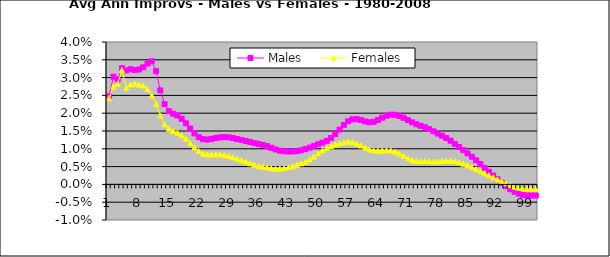
| Category | Males | Females |
|---|---|---|
| 0 | 0.025 | 0.024 |
| 1 | 0.03 | 0.028 |
| 2 | 0.029 | 0.028 |
| 3 | 0.033 | 0.032 |
| 4 | 0.032 | 0.027 |
| 5 | 0.032 | 0.028 |
| 6 | 0.032 | 0.028 |
| 7 | 0.032 | 0.028 |
| 8 | 0.033 | 0.028 |
| 9 | 0.034 | 0.027 |
| 10 | 0.035 | 0.025 |
| 11 | 0.032 | 0.023 |
| 12 | 0.026 | 0.019 |
| 13 | 0.023 | 0.017 |
| 14 | 0.021 | 0.016 |
| 15 | 0.02 | 0.015 |
| 16 | 0.019 | 0.014 |
| 17 | 0.018 | 0.014 |
| 18 | 0.017 | 0.013 |
| 19 | 0.016 | 0.012 |
| 20 | 0.014 | 0.01 |
| 21 | 0.013 | 0.009 |
| 22 | 0.013 | 0.009 |
| 23 | 0.013 | 0.008 |
| 24 | 0.013 | 0.008 |
| 25 | 0.013 | 0.008 |
| 26 | 0.013 | 0.008 |
| 27 | 0.013 | 0.008 |
| 28 | 0.013 | 0.008 |
| 29 | 0.013 | 0.008 |
| 30 | 0.013 | 0.007 |
| 31 | 0.013 | 0.007 |
| 32 | 0.012 | 0.006 |
| 33 | 0.012 | 0.006 |
| 34 | 0.012 | 0.006 |
| 35 | 0.011 | 0.005 |
| 36 | 0.011 | 0.005 |
| 37 | 0.011 | 0.005 |
| 38 | 0.01 | 0.005 |
| 39 | 0.01 | 0.004 |
| 40 | 0.009 | 0.004 |
| 41 | 0.009 | 0.005 |
| 42 | 0.009 | 0.005 |
| 43 | 0.009 | 0.005 |
| 44 | 0.009 | 0.006 |
| 45 | 0.01 | 0.006 |
| 46 | 0.01 | 0.006 |
| 47 | 0.01 | 0.007 |
| 48 | 0.011 | 0.008 |
| 49 | 0.011 | 0.009 |
| 50 | 0.012 | 0.01 |
| 51 | 0.012 | 0.01 |
| 52 | 0.013 | 0.011 |
| 53 | 0.014 | 0.011 |
| 54 | 0.015 | 0.012 |
| 55 | 0.017 | 0.012 |
| 56 | 0.018 | 0.012 |
| 57 | 0.018 | 0.012 |
| 58 | 0.018 | 0.011 |
| 59 | 0.018 | 0.011 |
| 60 | 0.018 | 0.01 |
| 61 | 0.017 | 0.01 |
| 62 | 0.018 | 0.01 |
| 63 | 0.018 | 0.009 |
| 64 | 0.019 | 0.01 |
| 65 | 0.019 | 0.01 |
| 66 | 0.02 | 0.01 |
| 67 | 0.02 | 0.009 |
| 68 | 0.019 | 0.009 |
| 69 | 0.019 | 0.008 |
| 70 | 0.018 | 0.007 |
| 71 | 0.017 | 0.007 |
| 72 | 0.017 | 0.007 |
| 73 | 0.016 | 0.006 |
| 74 | 0.016 | 0.007 |
| 75 | 0.016 | 0.007 |
| 76 | 0.015 | 0.006 |
| 77 | 0.014 | 0.006 |
| 78 | 0.014 | 0.007 |
| 79 | 0.013 | 0.007 |
| 80 | 0.012 | 0.007 |
| 81 | 0.011 | 0.006 |
| 82 | 0.011 | 0.006 |
| 83 | 0.01 | 0.006 |
| 84 | 0.009 | 0.005 |
| 85 | 0.008 | 0.005 |
| 86 | 0.007 | 0.004 |
| 87 | 0.006 | 0.004 |
| 88 | 0.005 | 0.003 |
| 89 | 0.004 | 0.003 |
| 90 | 0.002 | 0.002 |
| 91 | 0.001 | 0.001 |
| 92 | 0 | 0.001 |
| 93 | 0 | 0 |
| 94 | -0.001 | 0 |
| 95 | -0.002 | -0.001 |
| 96 | -0.003 | -0.001 |
| 97 | -0.003 | -0.001 |
| 98 | -0.003 | -0.001 |
| 99 | -0.003 | -0.001 |
| 100 | -0.003 | -0.001 |